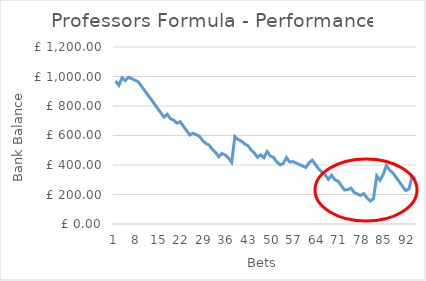
| Category | Bank Balance |
|---|---|
| 0 | 970 |
| 1 | 940 |
| 2 | 992.155 |
| 3 | 972.155 |
| 4 | 994.86 |
| 5 | 984.86 |
| 6 | 974.86 |
| 7 | 964.86 |
| 8 | 934.86 |
| 9 | 904.86 |
| 10 | 874.86 |
| 11 | 844.86 |
| 12 | 814.86 |
| 13 | 784.86 |
| 14 | 754.86 |
| 15 | 724.86 |
| 16 | 744.145 |
| 17 | 714.145 |
| 18 | 704.145 |
| 19 | 684.145 |
| 20 | 693.55 |
| 21 | 663.55 |
| 22 | 633.55 |
| 23 | 603.55 |
| 24 | 615.425 |
| 25 | 605.425 |
| 26 | 595.425 |
| 27 | 565.425 |
| 28 | 545.425 |
| 29 | 535.425 |
| 30 | 505.425 |
| 31 | 485.425 |
| 32 | 455.425 |
| 33 | 477.465 |
| 34 | 467.465 |
| 35 | 447.465 |
| 36 | 417.465 |
| 37 | 592.455 |
| 38 | 572.455 |
| 39 | 562.455 |
| 40 | 542.455 |
| 41 | 532.455 |
| 42 | 502.455 |
| 43 | 482.455 |
| 44 | 452.455 |
| 45 | 468.985 |
| 46 | 448.985 |
| 47 | 491.165 |
| 48 | 461.165 |
| 49 | 451.165 |
| 50 | 421.165 |
| 51 | 401.165 |
| 52 | 409.62 |
| 53 | 450.28 |
| 54 | 420.28 |
| 55 | 423.415 |
| 56 | 413.415 |
| 57 | 403.415 |
| 58 | 393.415 |
| 59 | 383.415 |
| 60 | 414.765 |
| 61 | 432.72 |
| 62 | 402.72 |
| 63 | 372.72 |
| 64 | 352.72 |
| 65 | 332.72 |
| 66 | 302.72 |
| 67 | 330.65 |
| 68 | 300.65 |
| 69 | 290.65 |
| 70 | 260.65 |
| 71 | 230.65 |
| 72 | 232.74 |
| 73 | 243.76 |
| 74 | 213.76 |
| 75 | 203.76 |
| 76 | 193.76 |
| 77 | 206.015 |
| 78 | 176.015 |
| 79 | 156.015 |
| 80 | 171.785 |
| 81 | 326.825 |
| 82 | 296.825 |
| 83 | 335.3 |
| 84 | 396.1 |
| 85 | 366.1 |
| 86 | 346.1 |
| 87 | 316.1 |
| 88 | 286.1 |
| 89 | 256.1 |
| 90 | 226.1 |
| 91 | 237.31 |
| 92 | 324.805 |
| 93 | 304.805 |